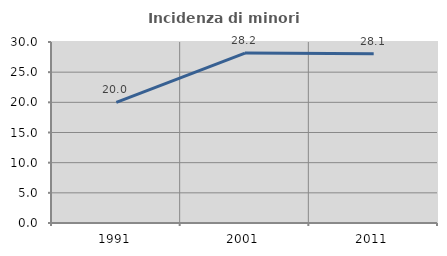
| Category | Incidenza di minori stranieri |
|---|---|
| 1991.0 | 20 |
| 2001.0 | 28.169 |
| 2011.0 | 28.07 |